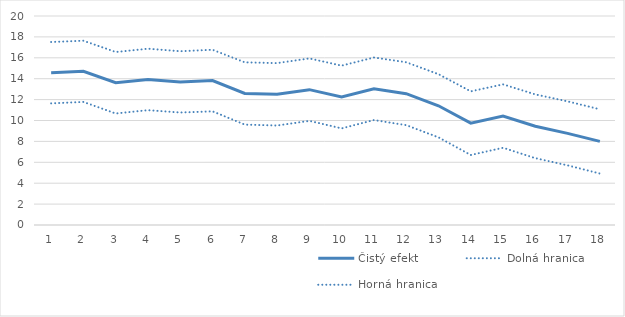
| Category | Čistý efekt | Dolná hranica | Horná hranica |
|---|---|---|---|
| 1.0 | 14.574 | 11.638 | 17.51 |
| 2.0 | 14.706 | 11.778 | 17.634 |
| 3.0 | 13.613 | 10.671 | 16.555 |
| 4.0 | 13.928 | 10.988 | 16.868 |
| 5.0 | 13.696 | 10.765 | 16.627 |
| 6.0 | 13.823 | 10.877 | 16.77 |
| 7.0 | 12.586 | 9.607 | 15.565 |
| 8.0 | 12.506 | 9.52 | 15.493 |
| 9.0 | 12.952 | 9.963 | 15.941 |
| 10.0 | 12.247 | 9.247 | 15.248 |
| 11.0 | 13.036 | 10.043 | 16.028 |
| 12.0 | 12.565 | 9.555 | 15.575 |
| 13.0 | 11.409 | 8.387 | 14.432 |
| 14.0 | 9.743 | 6.697 | 12.789 |
| 15.0 | 10.425 | 7.391 | 13.459 |
| 16.0 | 9.447 | 6.397 | 12.497 |
| 17.0 | 8.769 | 5.707 | 11.83 |
| 18.0 | 7.999 | 4.924 | 11.073 |